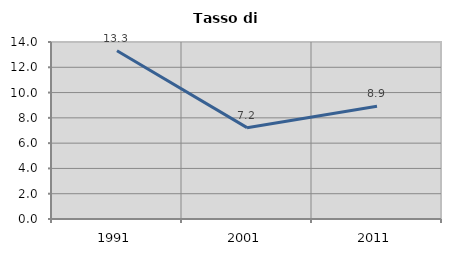
| Category | Tasso di disoccupazione   |
|---|---|
| 1991.0 | 13.309 |
| 2001.0 | 7.224 |
| 2011.0 | 8.911 |